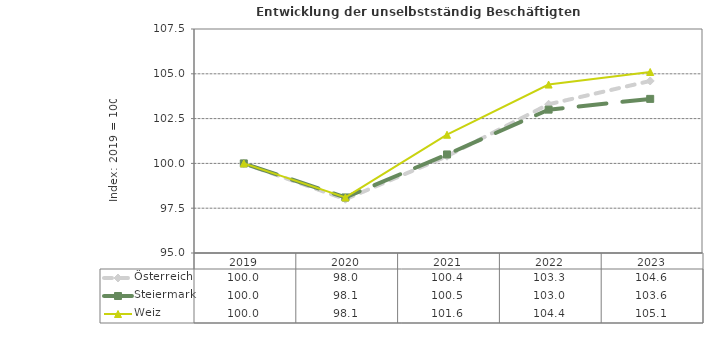
| Category | Österreich | Steiermark | Weiz |
|---|---|---|---|
| 2023.0 | 104.6 | 103.6 | 105.1 |
| 2022.0 | 103.3 | 103 | 104.4 |
| 2021.0 | 100.4 | 100.5 | 101.6 |
| 2020.0 | 98 | 98.1 | 98.1 |
| 2019.0 | 100 | 100 | 100 |